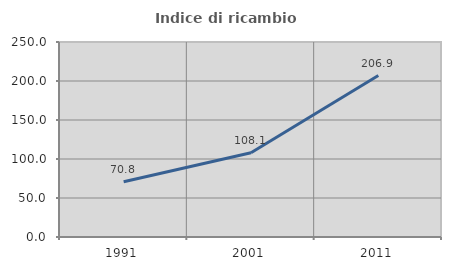
| Category | Indice di ricambio occupazionale  |
|---|---|
| 1991.0 | 70.833 |
| 2001.0 | 108.12 |
| 2011.0 | 206.936 |